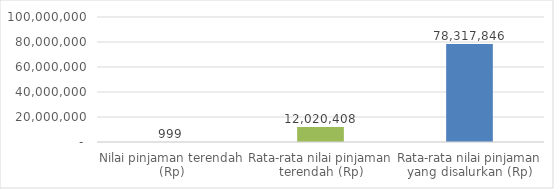
| Category | Series 0 |
|---|---|
| Nilai pinjaman terendah (Rp) | 999 |
| Rata-rata nilai pinjaman terendah (Rp) | 12020408.412 |
| Rata-rata nilai pinjaman yang disalurkan (Rp) | 78317846.242 |